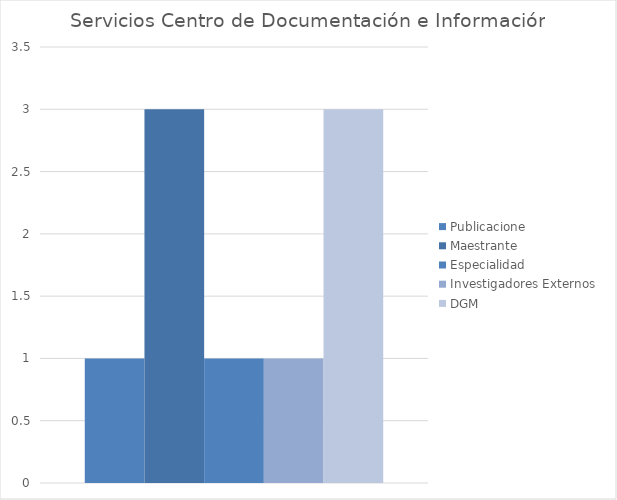
| Category | Publicacione | Maestrante | Especialidad | Investigadores Externos  | DGM |
|---|---|---|---|---|---|
| 0 | 1 | 3 | 1 | 1 | 3 |